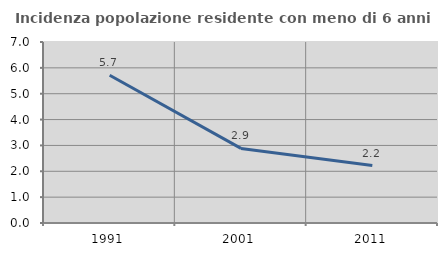
| Category | Incidenza popolazione residente con meno di 6 anni |
|---|---|
| 1991.0 | 5.714 |
| 2001.0 | 2.885 |
| 2011.0 | 2.222 |